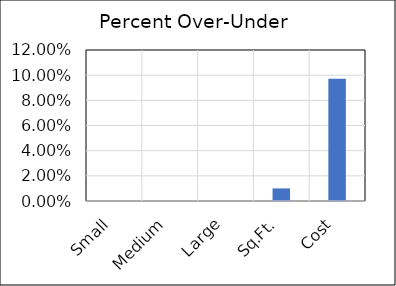
| Category | Over-Under |
|---|---|
| Small | 0 |
| Medium | 0 |
| Large | 0 |
| Sq.Ft. | 0.01 |
| Cost | 0.097 |